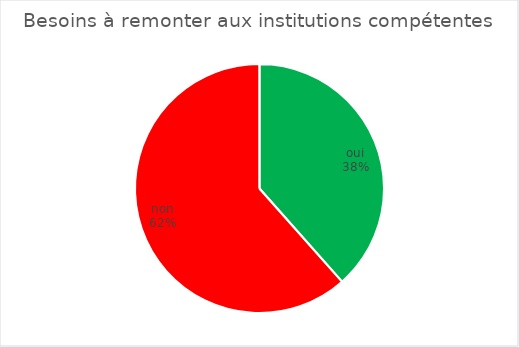
| Category | Besoins à remonter aux institutions compétentes  |
|---|---|
| oui | 5 |
| non | 8 |